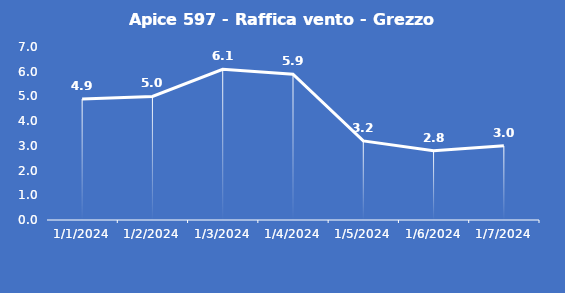
| Category | Apice 597 - Raffica vento - Grezzo (m/s) |
|---|---|
| 1/1/24 | 4.9 |
| 1/2/24 | 5 |
| 1/3/24 | 6.1 |
| 1/4/24 | 5.9 |
| 1/5/24 | 3.2 |
| 1/6/24 | 2.8 |
| 1/7/24 | 3 |